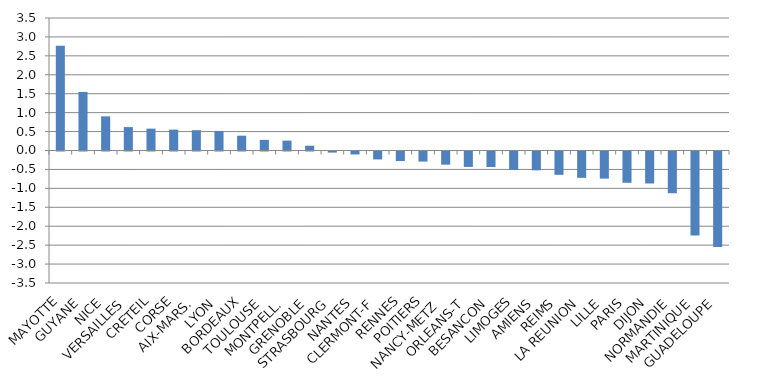
| Category | Évolution en % |
|---|---|
| MAYOTTE | 2.764 |
| GUYANE | 1.547 |
| NICE | 0.902 |
| VERSAILLES | 0.618 |
| CRETEIL | 0.578 |
| CORSE | 0.551 |
| AIX-MARS. | 0.536 |
| LYON | 0.516 |
| BORDEAUX | 0.391 |
| TOULOUSE | 0.281 |
| MONTPELL. | 0.261 |
| GRENOBLE | 0.126 |
| STRASBOURG | -0.029 |
| NANTES | -0.078 |
| CLERMONT-F | -0.21 |
| RENNES | -0.252 |
| POITIERS | -0.266 |
| NANCY-METZ  | -0.348 |
| ORLEANS-T | -0.407 |
| BESANCON | -0.41 |
| LIMOGES | -0.484 |
| AMIENS | -0.497 |
| REIMS | -0.616 |
| LA REUNION | -0.696 |
| LILLE | -0.717 |
| PARIS | -0.826 |
| DIJON | -0.845 |
| NORMANDIE | -1.102 |
| MARTINIQUE | -2.218 |
| GUADELOUPE | -2.525 |